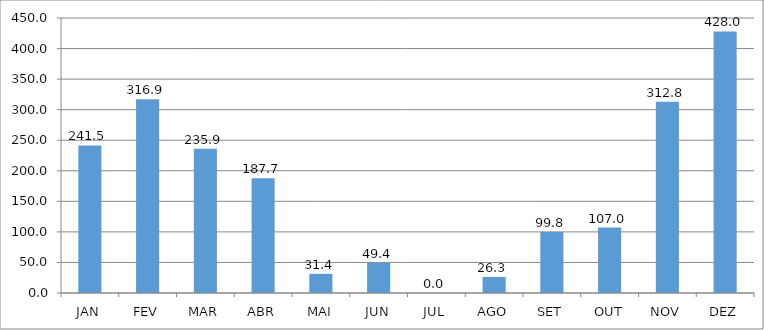
| Category | Series 0 |
|---|---|
| JAN | 241.5 |
| FEV | 316.9 |
| MAR | 235.9 |
| ABR | 187.7 |
| MAI | 31.4 |
| JUN | 49.4 |
| JUL | 0 |
| AGO | 26.3 |
| SET | 99.8 |
| OUT | 107 |
| NOV | 312.8 |
| DEZ | 428 |